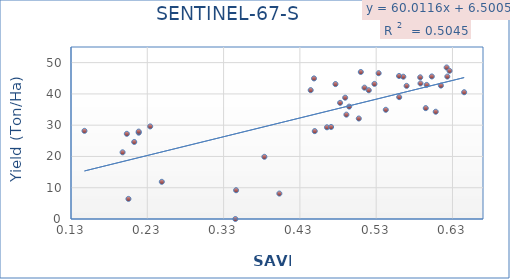
| Category | Series 0 |
|---|---|
| 0.514668 | 42 |
| 0.520297 | 41.17 |
| 0.587707 | 45.3 |
| 0.346387 | 9.2 |
| 0.205295 | 6.43 |
| 0.527699 | 43.2 |
| 0.569863 | 42.57 |
| 0.44947 | 28.1 |
| 0.622342 | 48.45 |
| 0.594981 | 35.45 |
| 0.218808 | 27.6 |
| 0.218706 | 27.95 |
| 0.147646 | 28.18 |
| 0.509838 | 47.01 |
| 0.560156 | 38.97 |
| 0.623233 | 45.55 |
| 0.6261 | 47.39 |
| 0.645296 | 40.53 |
| 0.596231 | 42.88 |
| 0.490958 | 33.37 |
| 0.197621 | 21.32 |
| 0.465493 | 29.32 |
| 0.608047 | 34.3 |
| 0.614831 | 42.66 |
| 0.482702 | 37.14 |
| 0.565557 | 45.5 |
| 0.559977 | 45.73 |
| 0.21288 | 24.63 |
| 0.49462 | 35.94 |
| 0.345424 | 0 |
| 0.448503 | 44.95 |
| 0.476635 | 43.14 |
| 0.542617 | 34.92 |
| 0.383447 | 19.89 |
| 0.533242 | 46.62 |
| 0.489354 | 38.79 |
| 0.602913 | 45.58 |
| 0.507209 | 32.13 |
| 0.203172 | 27.24 |
| 0.249007 | 11.89 |
| 0.444158 | 41.2 |
| 0.233793 | 29.61 |
| 0.588068 | 43.35 |
| 0.470905 | 29.42 |
| 0.403088 | 8.13 |